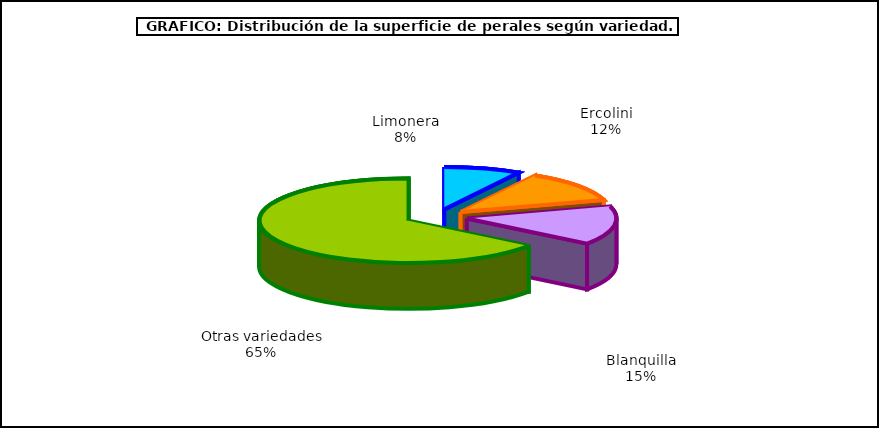
| Category | superficie |
|---|---|
| 0 | 1.817 |
| 1 | 2.638 |
| 2 | 3.234 |
| 3 | 14.199 |